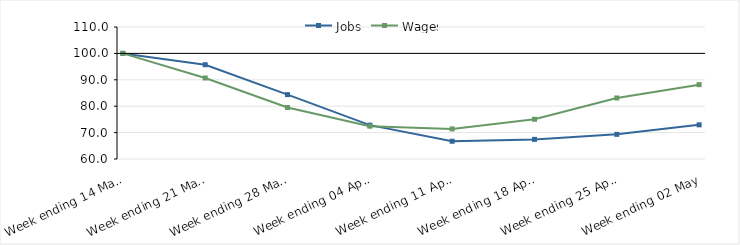
| Category | Jobs | Wages |
|---|---|---|
| 2020-03-14 | 100 | 100 |
| 2020-03-21 | 95.707 | 90.68 |
| 2020-03-28 | 84.382 | 79.515 |
| 2020-04-04 | 72.833 | 72.435 |
| 2020-04-11 | 66.726 | 71.4 |
| 2020-04-18 | 67.43 | 75.047 |
| 2020-04-25 | 69.334 | 83.114 |
| 2020-05-02 | 72.937 | 88.161 |